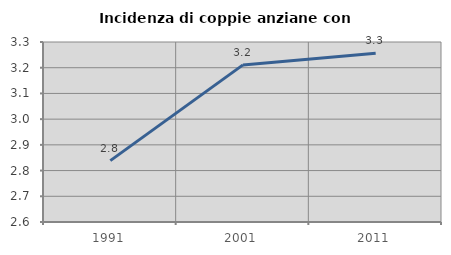
| Category | Incidenza di coppie anziane con figli |
|---|---|
| 1991.0 | 2.839 |
| 2001.0 | 3.211 |
| 2011.0 | 3.256 |